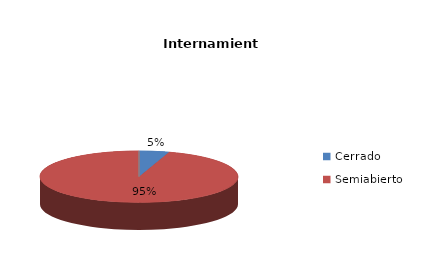
| Category | Series 0 |
|---|---|
| Cerrado | 2 |
| Semiabierto | 39 |
| Abierto | 0 |
| Terapeúticos | 0 |